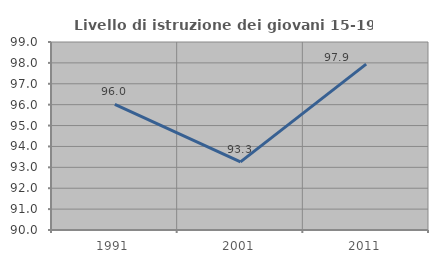
| Category | Livello di istruzione dei giovani 15-19 anni |
|---|---|
| 1991.0 | 96.013 |
| 2001.0 | 93.258 |
| 2011.0 | 97.938 |